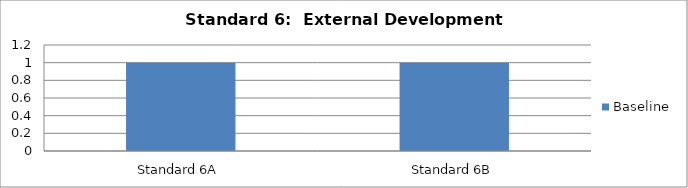
| Category | Baseline |
|---|---|
| Standard 6A | 1 |
| Standard 6B | 1 |